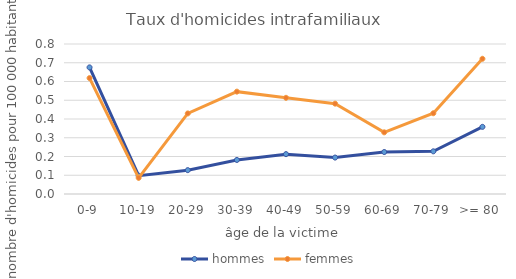
| Category | hommes | femmes |
|---|---|---|
| 0-9 | 0.675 | 0.618 |
| 10-19 | 0.098 | 0.086 |
| 20-29 | 0.127 | 0.43 |
| 30-39 | 0.182 | 0.546 |
| 40-49 | 0.213 | 0.513 |
| 50-59 | 0.194 | 0.482 |
| 60-69 | 0.224 | 0.329 |
| 70-79 | 0.228 | 0.431 |
| >= 80 | 0.358 | 0.721 |